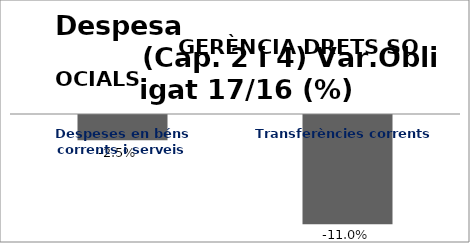
| Category | Series 0 |
|---|---|
| Despeses en béns corrents i serveis | -0.025 |
| Transferències corrents | -0.11 |